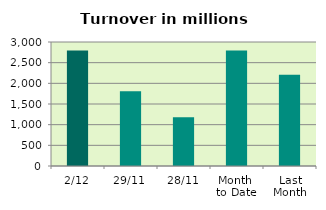
| Category | Series 0 |
|---|---|
| 2/12 | 2791.388 |
| 29/11 | 1809.007 |
| 28/11 | 1177.07 |
| Month 
to Date | 2791.388 |
| Last
Month | 2210.602 |